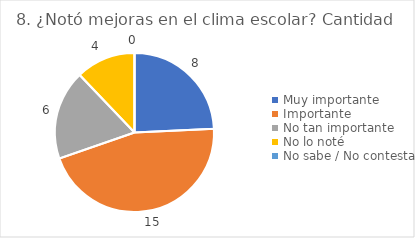
| Category | 8. ¿Notó mejoras en el clima escolar? |
|---|---|
| Muy importante  | 0.242 |
| Importante  | 0.455 |
| No tan importante  | 0.182 |
| No lo noté  | 0.121 |
| No sabe / No contesta | 0 |